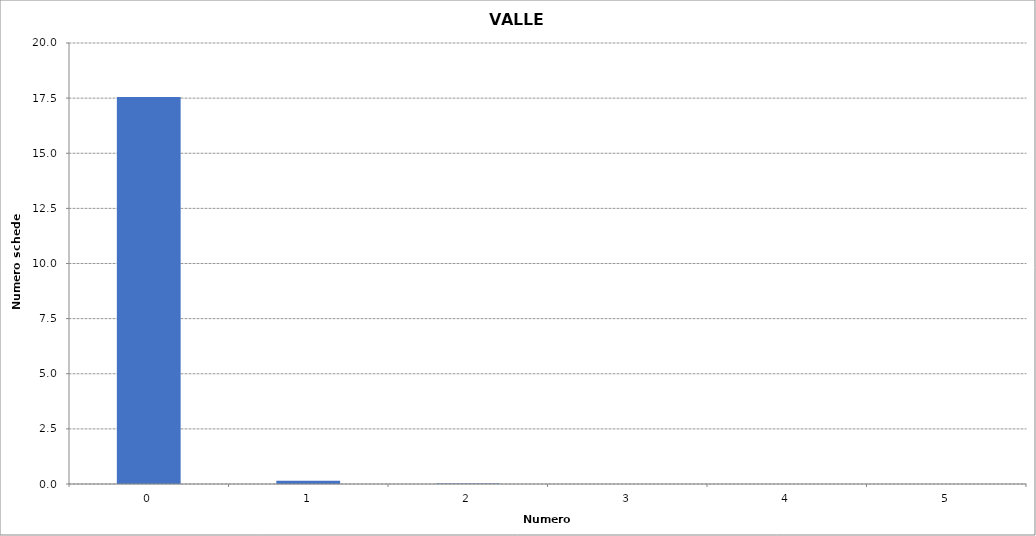
| Category | Series 0 |
|---|---|
| 0.0 | 17546 |
| 1.0 | 146 |
| 2.0 | 20 |
| 3.0 | 2 |
| 4.0 | 4 |
| 5.0 | 4 |